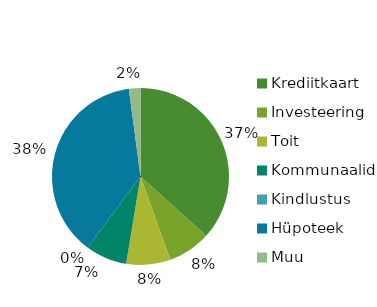
| Category | Kokku |
|---|---|
| Krediitkaart | 936.48 |
| Investeering | 200 |
| Toit | 205.61 |
| Kommunaalid | 194.2 |
| Kindlustus | 0 |
| Hüpoteek | 961.77 |
| Muu | 53.65 |